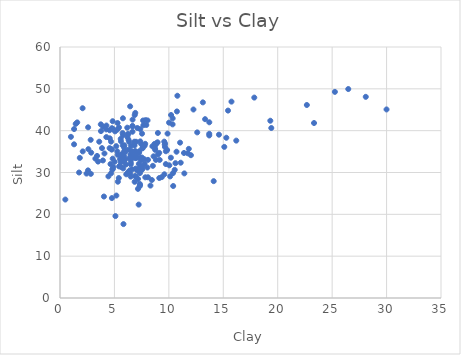
| Category | Series 0 |
|---|---|
| 6.777880048267974 | 34.004 |
| 7.3438094357963735 | 29.86 |
| 6.632126020949592 | 30.764 |
| 6.889237825547681 | 29.148 |
| 7.553639974306087 | 30.981 |
| 8.3101803592306 | 26.869 |
| 2.5730800607249336 | 30.509 |
| 10.186998222539188 | 33.537 |
| 6.917221857393429 | 33.444 |
| 15.752370100709172 | 46.941 |
| 7.826737273065902 | 36.856 |
| 4.687451823433726 | 29.793 |
| 0.49002850595662295 | 23.536 |
| 3.403669953547464 | 33.962 |
| 9.645170176195123 | 36.1 |
| 6.411278255373773 | 30.527 |
| 7.327032434780186 | 27.276 |
| 6.497443610294418 | 29.019 |
| 5.316780079596427 | 27.799 |
| 7.217223064989184 | 30.579 |
| 8.439117998385392 | 28.205 |
| 15.278949020677501 | 38.308 |
| 7.227206994202739 | 22.324 |
| 10.397482984612793 | 26.772 |
| 8.733777067021563 | 35.746 |
| 4.56219770175791 | 40.104 |
| 5.576321151707461 | 32.453 |
| 7.003305577532444 | 34.748 |
| 7.451810313558013 | 36.84 |
| 6.4993905052672005 | 33.187 |
| 7.066239478438767 | 30.558 |
| 7.775567798746593 | 36.409 |
| 7.345255281675961 | 31.185 |
| 7.313198412742246 | 26.689 |
| 7.547768408586926 | 30.697 |
| 4.839235397527148 | 33.309 |
| 10.379696181711338 | 29.849 |
| 5.092267702156867 | 19.578 |
| 10.042737641387092 | 31.718 |
| 7.107572757419831 | 40.638 |
| 5.7818403184574265 | 42.959 |
| 6.086610007893746 | 29.569 |
| 5.602961734365692 | 37.468 |
| 7.437413072156758 | 32.961 |
| 6.05739767572782 | 31.903 |
| 6.5547421675940285 | 33.241 |
| 7.524993709161279 | 33.583 |
| 6.971107967437945 | 30.944 |
| 6.453404223147018 | 29.698 |
| 8.027848428964546 | 31.182 |
| 10.607343718597022 | 32.227 |
| 11.422502500440416 | 29.786 |
| 5.831366373429489 | 17.666 |
| 10.539817648935696 | 30.633 |
| 4.7661480546009045 | 40.6 |
| 1.2916777727075157 | 36.737 |
| 2.4370211705789515 | 29.742 |
| 6.613794294087668 | 34.86 |
| 8.68145413785328 | 36.83 |
| 8.083335518286738 | 33.022 |
| 4.884243661982566 | 40.358 |
| 3.6030438016136372 | 37.361 |
| 6.254064054083614 | 30.099 |
| 6.9797550590282995 | 29.047 |
| 7.58705073018303 | 31.587 |
| 8.996136103213118 | 34.3 |
| 7.034121736633864 | 33.731 |
| 7.16635025318719 | 28.454 |
| 10.350913358949555 | 42.943 |
| 1.5825103965746194 | 41.974 |
| 6.583840254312321 | 35.115 |
| 2.6047220800410997 | 35.581 |
| 4.251106607754167 | 40.3 |
| 5.917914947695493 | 36.508 |
| 5.516605113365628 | 33.183 |
| 7.375107815349907 | 37.436 |
| 4.7182973772221715 | 35.543 |
| 4.808656591159817 | 30.744 |
| 7.836360309792688 | 28.852 |
| 5.401163755205907 | 28.675 |
| 9.842671606438543 | 35.372 |
| 5.9795796859892505 | 34.864 |
| 8.745525525454312 | 35.404 |
| 2.0765280689360566 | 45.364 |
| 4.265514083506986 | 41.224 |
| 5.757825887733048 | 34.545 |
| 7.9295005433732655 | 41.359 |
| 6.201862440051642 | 38.459 |
| 6.316735620174825 | 35.446 |
| 3.9618973394791936 | 40.963 |
| 7.5367081587571505 | 39.286 |
| 6.531211623041855 | 36.399 |
| 4.8521959847217175 | 30.85 |
| 5.4272282014084965 | 31.455 |
| 6.5015511434058055 | 31.939 |
| 8.88771921955427 | 37.036 |
| 7.164058892006253 | 26.085 |
| 10.782800969797108 | 48.344 |
| 6.443697543255382 | 45.811 |
| 2.81942788403137 | 37.806 |
| 6.659019200682778 | 39.747 |
| 5.288953152905194 | 41.833 |
| 1.442902679302648 | 41.623 |
| 5.748909226721835 | 39.418 |
| 6.6579658665934005 | 40.992 |
| 5.058010173926959 | 39.837 |
| 5.908334310690989 | 35.887 |
| 5.015809868262679 | 32.565 |
| 5.610010719994229 | 31.344 |
| 2.8639494018277105 | 34.738 |
| 6.927488591985494 | 35.06 |
| 7.370599837687308 | 40.368 |
| 10.20347594244241 | 43.745 |
| 3.7631472281553613 | 39.895 |
| 3.4968053548847706 | 32.61 |
| 3.7484139627474065 | 41.511 |
| 6.178636771156135 | 40.712 |
| 4.571177168909642 | 38.169 |
| 2.5816277444003077 | 40.802 |
| 6.667515736398087 | 42.634 |
| 4.084396671536197 | 34.551 |
| 6.381221857393427 | 33.444 |
| 7.555673640479824 | 33.212 |
| 6.846421717762368 | 36.441 |
| 8.485439771274002 | 36.261 |
| 6.3515460583025884 | 37.339 |
| 10.343843178944255 | 41.504 |
| 7.858241627941283 | 42.518 |
| 5.578405317141815 | 38.031 |
| 6.985473017810463 | 37.355 |
| 7.656792705341701 | 41.295 |
| 6.660308502164398 | 41.137 |
| 6.20636552318615 | 39.142 |
| 6.29799866783452 | 37.812 |
| 6.91499707908855 | 44.247 |
| 6.826258409712054 | 37.358 |
| 6.004180410546688 | 33.145 |
| 5.912050349032825 | 35.157 |
| 7.360135276767579 | 33.595 |
| 8.783832880447562 | 36.615 |
| 8.963701166042625 | 37.217 |
| 10.741819404458965 | 44.594 |
| 6.863119766737682 | 43.735 |
| 5.296072089476851 | 34.226 |
| 5.265823472541541 | 40.275 |
| 5.422846865876636 | 40.754 |
| 4.2562186157563815 | 38.469 |
| 7.586119702592569 | 35.89 |
| 7.630250654697107 | 42.428 |
| 4.83741027581506 | 42.261 |
| 1.8190027359170955 | 33.492 |
| 5.802911209447032 | 30.983 |
| 5.167079082191364 | 36.296 |
| 9.623472191364925 | 36.65 |
| 7.268520185630862 | 34.745 |
| 6.901200943394954 | 35.079 |
| 12.25970123018773 | 45.061 |
| 5.894663787278461 | 32.598 |
| 4.639400549043671 | 32.017 |
| 5.764348677270249 | 36.457 |
| 6.825445111097466 | 36.921 |
| 4.687756153023102 | 37.381 |
| 5.677701547192839 | 33.647 |
| 6.472926008492607 | 34.258 |
| 8.99197775383604 | 39.447 |
| 2.833477263639132 | 29.682 |
| 5.6343823049569295 | 33.982 |
| 5.607291210953164 | 34.178 |
| 15.09266791950617 | 36.122 |
| 13.71146564394573 | 38.855 |
| 9.157408558778855 | 33.006 |
| 15.435084486159951 | 44.8 |
| 4.890790161859968 | 31.336 |
| 4.763301890600076 | 35.498 |
| 9.576756153023098 | 37.381 |
| 11.088832435152241 | 32.34 |
| 9.351112874795092 | 28.898 |
| 8.809979342582004 | 33.013 |
| 7.0089342088028985 | 33.463 |
| 10.11733179286729 | 29.066 |
| 1.7524456699937545 | 29.997 |
| 8.083281319264735 | 28.857 |
| 12.029295724331092 | 34.133 |
| 12.605534997505472 | 39.589 |
| 13.3290044529533 | 42.747 |
| 13.124173546122393 | 46.764 |
| 6.268575617906663 | 39.183 |
| 3.941992882715738 | 32.878 |
| 9.722264931473212 | 32.016 |
| 1.2945267971951893 | 40.384 |
| 11.74625059055198 | 34.584 |
| 16.19366054564142 | 37.622 |
| 8.042748398008143 | 42.451 |
| 11.031066368503176 | 37.136 |
| 7.752321978153006 | 33.158 |
| 4.44655235100155 | 29.074 |
| 4.767958135376233 | 23.882 |
| 5.8812497641064425 | 33.879 |
| 19.411001973616692 | 40.632 |
| 14.118602608370963 | 27.931 |
| 17.847987671182537 | 47.907 |
| 7.774232104574033 | 32.058 |
| 7.244045809996869 | 32.064 |
| 9.727200943394948 | 35.079 |
| 1.0035702780832025 | 38.524 |
| 5.77989034676466 | 38.894 |
| 11.83121530997424 | 35.649 |
| 14.602018374237247 | 39.042 |
| 13.71457892368882 | 42.003 |
| 23.337382369102045 | 41.826 |
| 4.034956291910049 | 24.257 |
| 8.532135670746825 | 31.595 |
| 13.709639631642958 | 39.257 |
| 28.08996961767089 | 48.087 |
| 22.67602212531473 | 46.136 |
| 19.320898992370275 | 42.373 |
| 9.121542294396065 | 28.676 |
| 3.2490207894287266 | 33.312 |
| 3.8581972564625886 | 35.829 |
| 8.596108196500126 | 33.866 |
| 7.582201769840495 | 35.784 |
| 4.557982648364174 | 35.833 |
| 9.64629903011324 | 36.953 |
| 7.355946260962611 | 26.996 |
| 11.390670779993002 | 34.667 |
| 9.58798854708391 | 29.569 |
| 10.704712226839732 | 34.967 |
| 29.996842797794045 | 45.074 |
| 26.48171152868443 | 49.951 |
| 25.252993837451513 | 49.271 |
| 10.016373342346213 | 41.916 |
| 2.0893470243791796 | 35.047 |
| 6.660130763389674 | 33.64 |
| 6.507184097479069 | 32.395 |
| 5.26656163247759 | 35.044 |
| 5.178233273682707 | 24.487 |
| 7.278557119099688 | 35.089 |
| 6.858389640334593 | 27.775 |
| 9.117383131402462 | 34.687 |
| 9.879635118265043 | 39.302 |